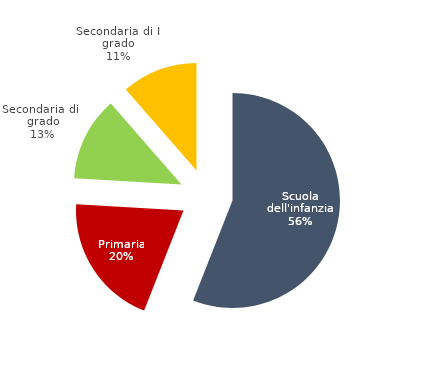
| Category | iscritti |
|---|---|
| Scuola dell'infanzia | 30808 |
| Primaria | 10977 |
| Secondaria di I grado | 6976 |
| Secondaria di II grado | 6286 |